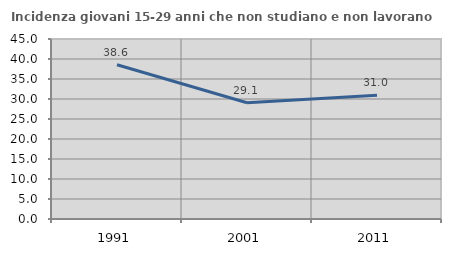
| Category | Incidenza giovani 15-29 anni che non studiano e non lavorano  |
|---|---|
| 1991.0 | 38.552 |
| 2001.0 | 29.075 |
| 2011.0 | 30.952 |